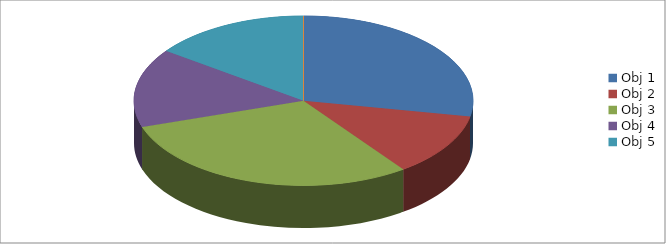
| Category | Series 0 |
|---|---|
| Obj 1 | 0.28 |
| Obj 2 | 0.12 |
| Obj 3 | 0.3 |
| Obj 4 | 0.15 |
| Obj 5 | 0.15 |